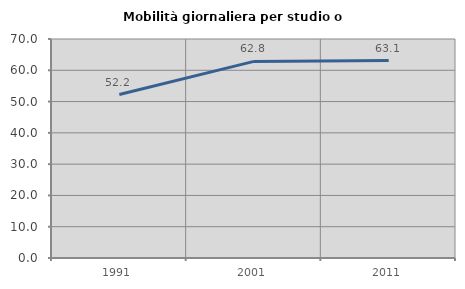
| Category | Mobilità giornaliera per studio o lavoro |
|---|---|
| 1991.0 | 52.236 |
| 2001.0 | 62.838 |
| 2011.0 | 63.098 |